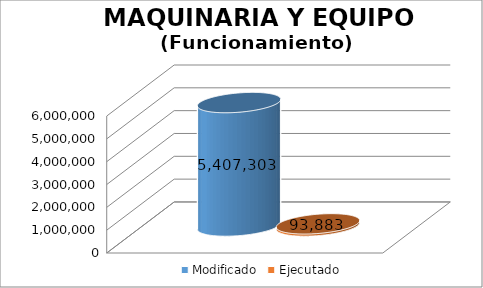
| Category | Modificado | Ejecutado |
|---|---|---|
| 0 | 5407303 | 93883.11 |